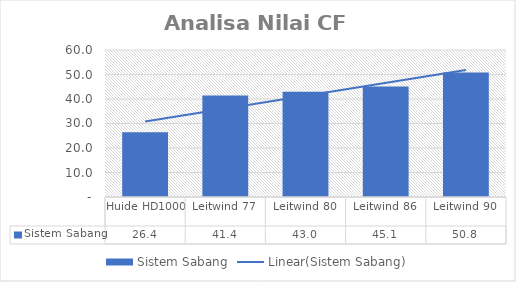
| Category | Sistem Sabang |
|---|---|
| Huide HD1000 | 26.4 |
| Leitwind 77 | 41.4 |
| Leitwind 80 | 43 |
| Leitwind 86 | 45.1 |
| Leitwind 90 | 50.8 |